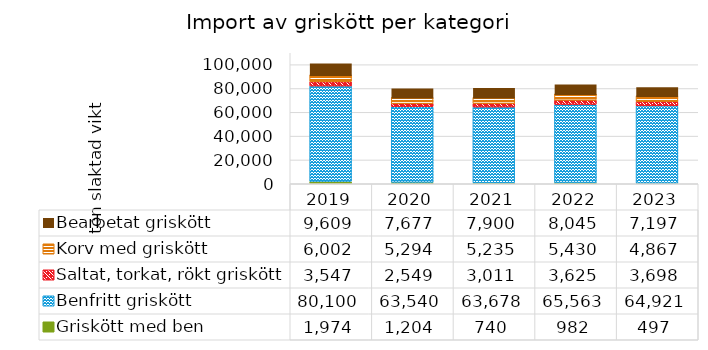
| Category | Griskött med ben | Benfritt griskött | Saltat, torkat, rökt griskött | Korv med griskött | Bearbetat griskött |
|---|---|---|---|---|---|
| 2019 | 1974 | 80100 | 3547.191 | 6002.37 | 9608.889 |
| 2020 | 1204 | 63539.506 | 2549.438 | 5294.074 | 7677.037 |
| 2021 | 740 | 63677.778 | 3011.236 | 5234.963 | 7900.247 |
| 2022 | 982 | 65562.963 | 3624.719 | 5430.272 | 8045.432 |
| 2023 | 497 | 64920.988 | 3697.753 | 4867.16 | 7197.037 |